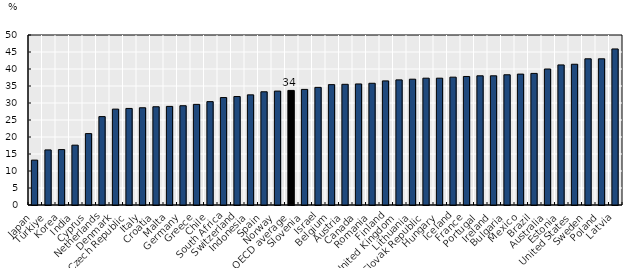
| Category | Series 1 |
|---|---|
| Japan | 13.2 |
| Türkiye | 16.2 |
| Korea | 16.3 |
| India | 17.6 |
| Cyprus | 21 |
| Netherlands | 26 |
| Denmark | 28.2 |
| Czech Republic | 28.4 |
| Italy | 28.6 |
| Croatia | 28.9 |
| Malta | 29 |
| Germany | 29.2 |
| Greece | 29.6 |
| Chile | 30.4 |
| South Africa | 31.6 |
| Switzerland | 31.9 |
| Indonesia | 32.4 |
| Spain | 33.3 |
| Norway | 33.5 |
| OECD average | 33.7 |
| Slovenia | 34 |
| Israel | 34.6 |
| Belgium | 35.4 |
| Austria | 35.5 |
| Canada | 35.6 |
| Romania | 35.8 |
| Finland | 36.5 |
| United Kingdom | 36.8 |
| Lithuania | 37 |
| Slovak Republic | 37.3 |
| Hungary | 37.3 |
| Iceland | 37.6 |
| France | 37.8 |
| Portugal | 38 |
| Ireland | 38 |
| Bulgaria | 38.3 |
| Mexico | 38.5 |
| Brazil | 38.7 |
| Australia | 40 |
| Estonia | 41.2 |
| United States | 41.4 |
| Sweden | 43 |
| Poland | 43 |
| Latvia | 45.9 |